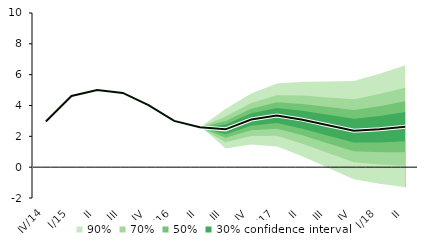
| Category | linka | Střed předpovědi |
|---|---|---|
| IV/14 | 2.96 | 2.96 |
| I/15 | 4.618 | 4.618 |
| II | 5.004 | 5.004 |
| III | 4.815 | 4.815 |
| IV | 4.027 | 4.027 |
| I/16 | 3 | 3 |
| II | 2.585 | 2.585 |
| III | 2.453 | 2.453 |
| IV | 3.091 | 3.091 |
| I/17 | 3.351 | 3.351 |
| II | 3.082 | 3.082 |
| III | 2.718 | 2.718 |
| IV | 2.367 | 2.367 |
| I/18 | 2.462 | 2.462 |
| II | 2.625 | 2.625 |